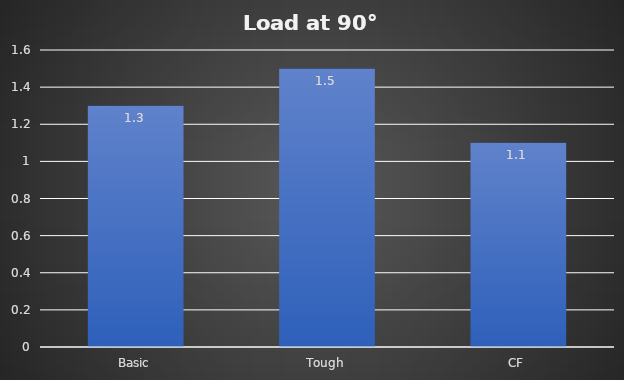
| Category | Load at 90° |
|---|---|
| Basic | 1.3 |
| Tough | 1.5 |
| CF | 1.1 |